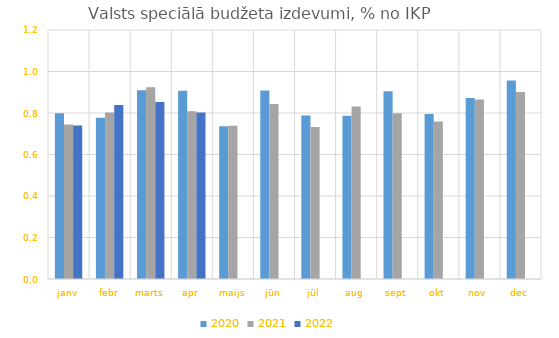
| Category | 2020 | 2021 | 2022 |
|---|---|---|---|
| janv | 0.799 | 0.744 | 0.739 |
| febr | 0.777 | 0.802 | 0.839 |
| marts | 0.91 | 0.924 | 0.853 |
| apr | 0.908 | 0.809 | 0.802 |
| maijs | 0.736 | 0.739 | 0 |
| jūn | 0.909 | 0.844 | 0 |
| jūl | 0.787 | 0.732 | 0 |
| aug | 0.786 | 0.831 | 0 |
| sept | 0.904 | 0.799 | 0 |
| okt | 0.795 | 0.759 | 0 |
| nov | 0.873 | 0.866 | 0 |
| dec | 0.957 | 0.901 | 0 |